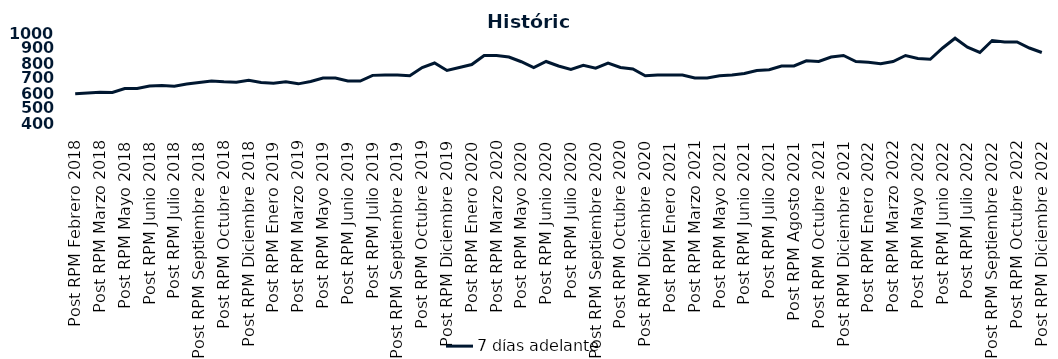
| Category | 7 días adelante  |
|---|---|
| Post RPM Febrero 2018 | 595 |
| Pre RPM Marzo 2018 | 600 |
| Post RPM Marzo 2018 | 605 |
| Pre RPM Mayo 2018 | 603 |
| Post RPM Mayo 2018 | 630 |
| Pre RPM Junio 2018 | 630 |
| Post RPM Junio 2018 | 646.5 |
| Pre RPM Julio 2018 | 650 |
| Post RPM Julio 2018 | 645 |
| Pre RPM Septiembre 2018 | 660 |
| Post RPM Septiembre 2018 | 670 |
| Pre RPM Octubre 2018 | 680 |
| Post RPM Octubre 2018 | 675 |
| Pre RPM Diciembre 2018 | 672.5 |
| Post RPM Diciembre 2018 | 685 |
| Pre RPM Enero 2019 | 670 |
| Post RPM Enero 2019 | 665 |
| Pre RPM Marzo 2019 | 675 |
| Post RPM Marzo 2019 | 661 |
| Pre RPM Mayo 2019 | 677 |
| Post RPM Mayo 2019 | 700 |
| Pre RPM Junio 2019 | 700.5 |
| Post RPM Junio 2019 | 680 |
| Pre RPM Julio 2019 | 680 |
| Post RPM Julio 2019 | 717.5 |
| Pre RPM Septiembre 2019 | 720 |
| Post RPM Septiembre 2019 | 720 |
| Pre RPM Octubre 2019 | 715 |
| Post RPM Octubre 2019 | 770 |
| Pre RPM Diciembre 2019 | 800 |
| Post RPM Diciembre 2019 | 750 |
| Pre RPM Enero 2020 | 770 |
| Post RPM Enero 2020 | 790 |
| Pre RPM Marzo 2020 | 850 |
| Post RPM Marzo 2020 | 850 |
| Pre RPM Mayo 2020 | 840 |
| Post RPM Mayo 2020 | 808.5 |
| Pre RPM Junio 2020 | 770 |
| Post RPM Junio 2020 | 810 |
| Pre RPM Julio 2020 | 780 |
| Post RPM Julio 2020 | 757 |
| Pre RPM Septiembre 2020 | 785 |
| Post RPM Septiembre 2020 | 765 |
| Pre RPM Octubre 2020 | 800 |
| Post RPM Octubre 2020 | 770 |
| Pre RPM Diciembre 2020 | 760 |
| Post RPM Diciembre 2020 | 715 |
| Pre RPM Enero 2021 | 720 |
| Post RPM Enero 2021 | 720 |
| Pre RPM Marzo 2021 | 720 |
| Post RPM Marzo 2021 | 700 |
| Pre RPM Mayo 2021 | 700 |
| Post RPM Mayo 2021 | 715 |
| Pre RPM Junio 2021 | 720 |
| Post RPM Junio 2021 | 730 |
| Pre RPM Julio 2021 | 750 |
| Post RPM Julio 2021 | 755 |
| Pre RPM Agosto 2021 | 780 |
| Post RPM Agosto 2021 | 780 |
| Pre RPM Octubre 2021 | 815 |
| Post RPM Octubre 2021 | 810 |
| Pre RPM Diciembre 2021 | 840 |
| Post RPM Diciembre 2021 | 850 |
| Pre RPM Enero 2022 | 810 |
| Post RPM Enero 2022 | 805 |
| Pre RPM Marzo 2022 | 795 |
| Post RPM Marzo 2022 | 810 |
| Pre RPM Mayo 2022 | 850 |
| Post RPM Mayo 2022 | 830 |
| Pre RPM Junio 2022 | 825 |
| Post RPM Junio 2022 | 900 |
| Pre RPM Julio 2022 | 965 |
| Post RPM Julio 2022 | 905 |
| Pre RPM Septiembre 2022 | 870 |
| Post RPM Septiembre 2022 | 950 |
| Pre RPM Octubre 2022 | 940 |
| Post RPM Octubre 2022 | 940 |
| Pre RPM Diciembre 2022 | 900 |
| Post RPM Diciembre 2022 | 870 |